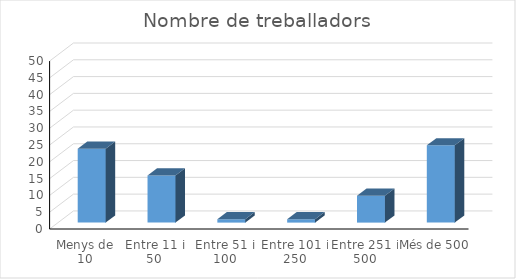
| Category | Series 0 |
|---|---|
| Menys de 10 | 22 |
| Entre 11 i 50 | 14 |
| Entre 51 i 100 | 1 |
| Entre 101 i 250 | 1 |
| Entre 251 i 500 | 8 |
| Més de 500 | 23 |